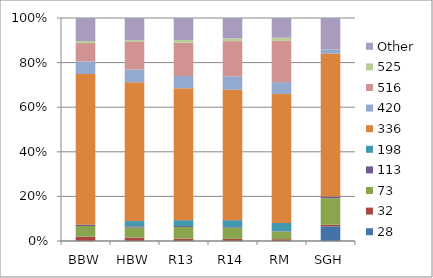
| Category | 28 | 32 | 73 | 113 | 198 | 336 | 420 | 516 | 525 | Other |
|---|---|---|---|---|---|---|---|---|---|---|
| BBW | 0 | 0.019 | 0.048 | 0.006 | 0 | 0.675 | 0.056 | 0.082 | 0.009 | 0.104 |
| HBW | 0 | 0.015 | 0.045 | 0.005 | 0.024 | 0.622 | 0.057 | 0.124 | 0.008 | 0.1 |
| R13 | 0 | 0.011 | 0.051 | 0.004 | 0.026 | 0.589 | 0.054 | 0.149 | 0.012 | 0.098 |
| R14 | 0 | 0.01 | 0.049 | 0.003 | 0.031 | 0.577 | 0.059 | 0.156 | 0.012 | 0.09 |
| RM | 0 | 0.008 | 0.033 | 0.002 | 0.036 | 0.562 | 0.052 | 0.18 | 0.014 | 0.086 |
| SGH | 0.064 | 0.007 | 0.115 | 0.007 | 0 | 0.619 | 0.018 | 0 | 0 | 0.137 |